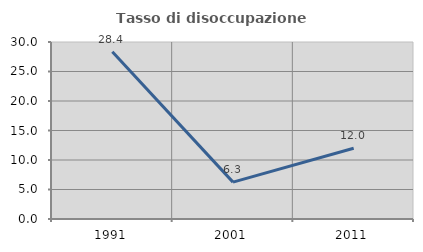
| Category | Tasso di disoccupazione giovanile  |
|---|---|
| 1991.0 | 28.358 |
| 2001.0 | 6.25 |
| 2011.0 | 12 |